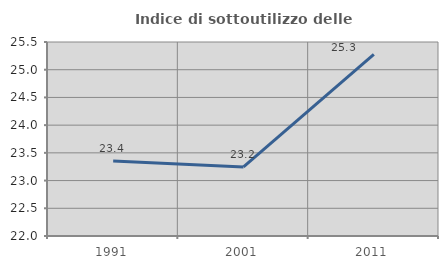
| Category | Indice di sottoutilizzo delle abitazioni  |
|---|---|
| 1991.0 | 23.355 |
| 2001.0 | 23.246 |
| 2011.0 | 25.275 |